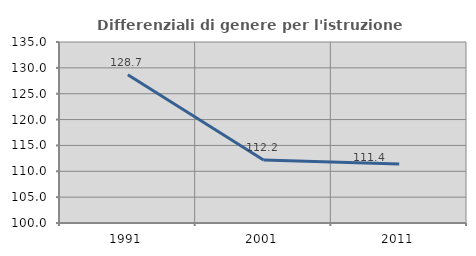
| Category | Differenziali di genere per l'istruzione superiore |
|---|---|
| 1991.0 | 128.658 |
| 2001.0 | 112.178 |
| 2011.0 | 111.407 |